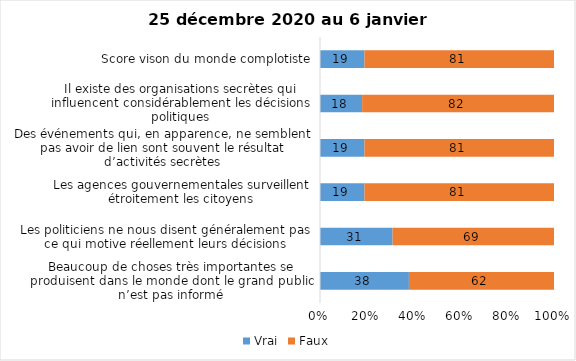
| Category | Vrai | Faux |
|---|---|---|
| Beaucoup de choses très importantes se produisent dans le monde dont le grand public n’est pas informé | 38 | 62 |
| Les politiciens ne nous disent généralement pas ce qui motive réellement leurs décisions | 31 | 69 |
| Les agences gouvernementales surveillent étroitement les citoyens | 19 | 81 |
| Des événements qui, en apparence, ne semblent pas avoir de lien sont souvent le résultat d’activités secrètes | 19 | 81 |
| Il existe des organisations secrètes qui influencent considérablement les décisions politiques | 18 | 82 |
| Score vison du monde complotiste | 19 | 81 |